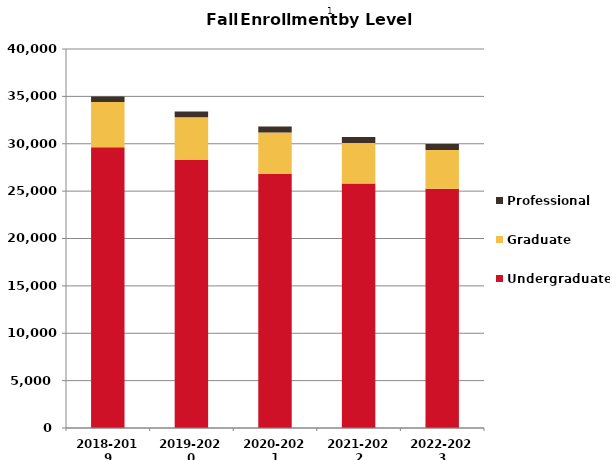
| Category | Undergraduate | Graduate | Professional |
|---|---|---|---|
| 2018-2019 | 29621 | 4774 | 597 |
| 2019-2020 | 28294 | 4498 | 599 |
| 2020-2021 | 26846 | 4352 | 627 |
| 2021-2022 | 25808 | 4264 | 636 |
| 2022-2023 | 25241 | 4094 | 634 |